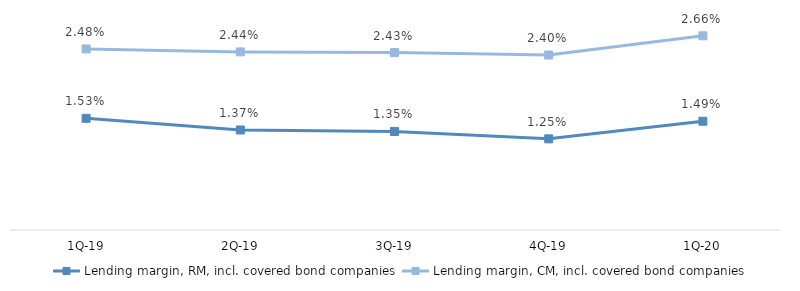
| Category | Lending margin, RM, incl. covered bond companies | Lending margin, CM, incl. covered bond companies |
|---|---|---|
| 1Q-20 | 0.015 | 0.027 |
| 4Q-19 | 0.012 | 0.024 |
| 3Q-19 | 0.014 | 0.024 |
| 2Q-19 | 0.014 | 0.024 |
| 1Q-19 | 0.015 | 0.025 |